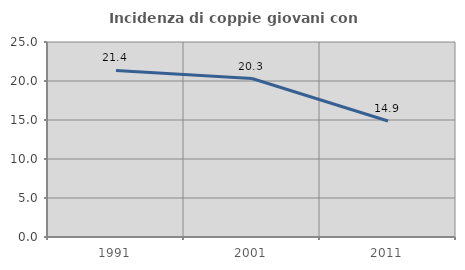
| Category | Incidenza di coppie giovani con figli |
|---|---|
| 1991.0 | 21.36 |
| 2001.0 | 20.317 |
| 2011.0 | 14.865 |